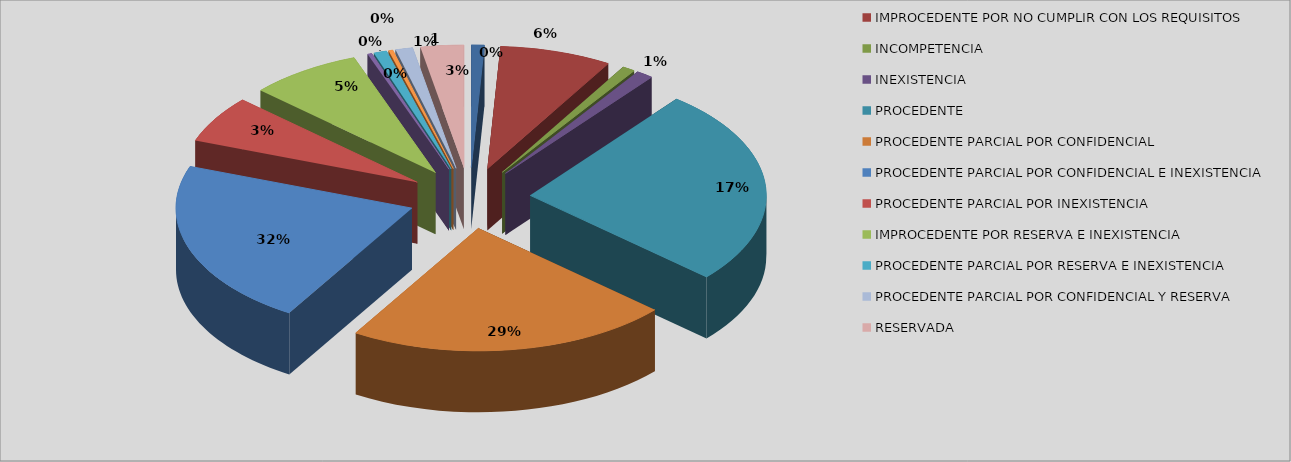
| Category | Series 0 | Series 1 |
|---|---|---|
| IMPROCEDENTE NO RESPONDIO PREVENCIÓN | 3 | 0.009 |
| IMPROCEDENTE POR NO CUMPLIR CON LOS REQUISITOS | 26 | 0.077 |
| INCOMPETENCIA | 3 | 0.009 |
| INEXISTENCIA  | 4 | 0.012 |
| PROCEDENTE | 88 | 0.26 |
| PROCEDENTE PARCIAL POR CONFIDENCIAL | 75 | 0.222 |
| PROCEDENTE PARCIAL POR CONFIDENCIAL E INEXISTENCIA | 74 | 0.219 |
| PROCEDENTE PARCIAL POR INEXISTENCIA | 21 | 0.062 |
| IMPROCEDENTE POR RESERVA E INEXISTENCIA | 26 | 0.077 |
| PROCEDENTE PARCIAL POR RESERVA | 1 | 0.003 |
| PROCEDENTE PARCIAL POR RESERVA E INEXISTENCIA | 3 | 0.009 |
| PROCEDENTE PARCIAL POR CONFIDENCIAL RESERVADA E INEXISTENCIA | 1 | 0.003 |
| PROCEDENTE PARCIAL POR CONFIDENCIAL Y RESERVA | 4 | 0.012 |
| RESERVADA | 10 | 0.03 |